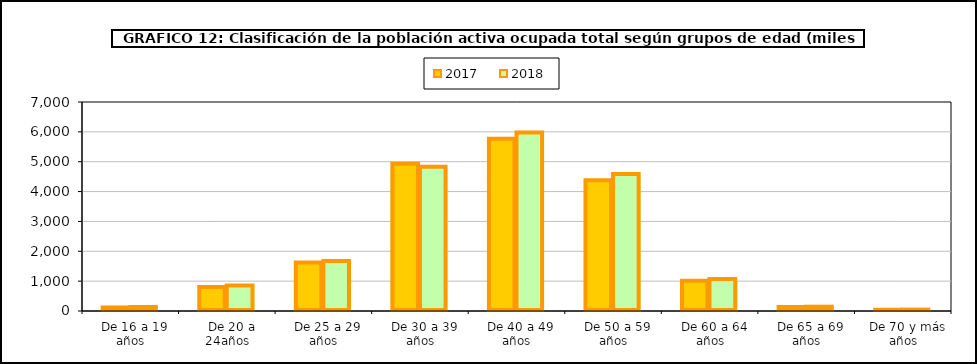
| Category | 2017 | 2018 |
|---|---|---|
|   De 16 a 19 años | 117.95 | 134.025 |
|   De 20 a 24años | 803.15 | 855.275 |
|   De 25 a 29 años | 1626.05 | 1673 |
|   De 30 a 39 años | 4933.075 | 4834.3 |
|   De 40 a 49 años | 5770.85 | 5974.8 |
|   De 50 a 59 años | 4382.5 | 4589.5 |
|   De 60 a 64 años | 1014.975 | 1075.4 |
|   De 65 a 69 años | 134.7 | 144.35 |
|   De 70 y más años | 41.525 | 47.025 |